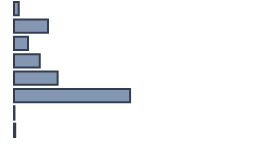
| Category | Percentatge |
|---|---|
| 0 | 1.978 |
| 1 | 14.153 |
| 2 | 5.871 |
| 3 | 10.756 |
| 4 | 18.17 |
| 5 | 48.367 |
| 6 | 0.199 |
| 7 | 0.507 |